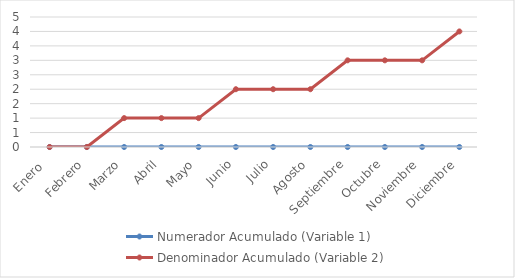
| Category | Numerador Acumulado (Variable 1) | Denominador Acumulado (Variable 2) |
|---|---|---|
| Enero  | 0 | 0 |
| Febrero | 0 | 0 |
| Marzo | 0 | 1 |
| Abril | 0 | 1 |
| Mayo | 0 | 1 |
| Junio | 0 | 2 |
| Julio | 0 | 2 |
| Agosto | 0 | 2 |
| Septiembre | 0 | 3 |
| Octubre | 0 | 3 |
| Noviembre | 0 | 3 |
| Diciembre | 0 | 4 |